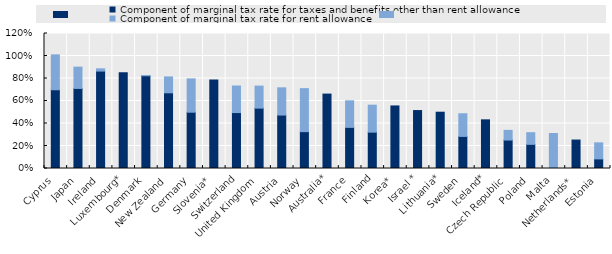
| Category | Component of marginal tax rate for taxes and benefits other than rent allowance | Component of marginal tax rate for rent allowance |
|---|---|---|
| Cyprus | 0.7 | 0.31 |
| Japan | 0.712 | 0.189 |
| Ireland | 0.866 | 0.02 |
| Luxembourg* | 0.852 | 0 |
| Denmark | 0.824 | 0.002 |
| New Zealand | 0.673 | 0.141 |
| Germany | 0.501 | 0.296 |
| Slovenia* | 0.786 | 0 |
| Switzerland | 0.497 | 0.236 |
| United Kingdom | 0.537 | 0.196 |
| Austria | 0.475 | 0.242 |
| Norway | 0.328 | 0.382 |
| Australia* | 0.661 | 0 |
| France | 0.366 | 0.236 |
| Finland | 0.323 | 0.24 |
| Korea* | 0.556 | 0 |
| Israel * | 0.515 | 0 |
| Lithuania* | 0.5 | 0 |
| Sweden | 0.285 | 0.201 |
| Iceland* | 0.432 | 0 |
| Czech Republic | 0.253 | 0.086 |
| Poland | 0.215 | 0.104 |
| Malta | -0.001 | 0.311 |
| Netherlands* | 0.253 | 0 |
| Estonia | 0.085 | 0.143 |